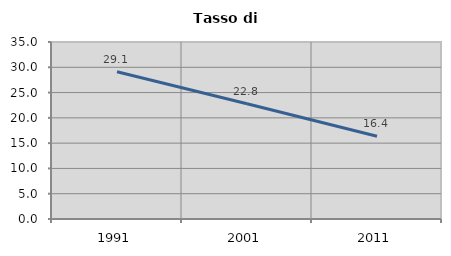
| Category | Tasso di disoccupazione   |
|---|---|
| 1991.0 | 29.131 |
| 2001.0 | 22.801 |
| 2011.0 | 16.367 |